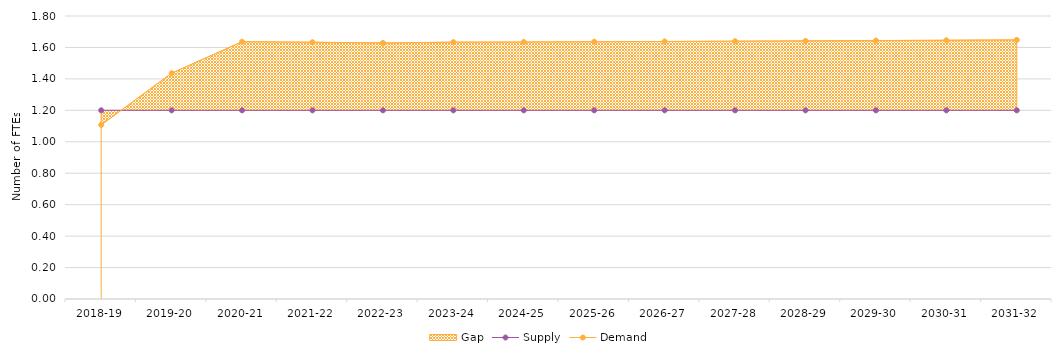
| Category | Supply | Demand |
|---|---|---|
| 2018-19 | 1.2 | 1.107 |
| 2019-20 | 1.2 | 1.436 |
| 2020-21 | 1.2 | 1.636 |
| 2021-22 | 1.2 | 1.633 |
| 2022-23 | 1.2 | 1.629 |
| 2023-24 | 1.2 | 1.633 |
| 2024-25 | 1.2 | 1.635 |
| 2025-26 | 1.2 | 1.636 |
| 2026-27 | 1.2 | 1.638 |
| 2027-28 | 1.2 | 1.64 |
| 2028-29 | 1.2 | 1.642 |
| 2029-30 | 1.2 | 1.644 |
| 2030-31 | 1.2 | 1.646 |
| 2031-32 | 1.2 | 1.648 |